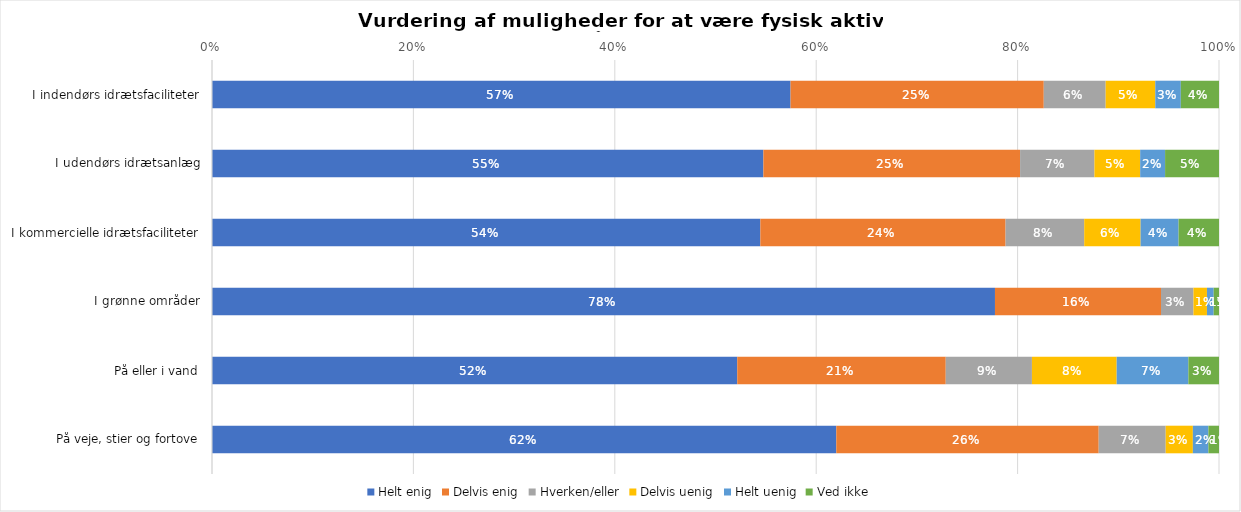
| Category | Helt enig | Delvis enig | Hverken/eller | Delvis uenig | Helt uenig | Ved ikke |
|---|---|---|---|---|---|---|
| I indendørs idrætsfaciliteter | 0.575 | 0.251 | 0.061 | 0.049 | 0.025 | 0.038 |
| I udendørs idrætsanlæg | 0.548 | 0.255 | 0.074 | 0.045 | 0.025 | 0.054 |
| I kommercielle idrætsfaciliteter | 0.545 | 0.244 | 0.078 | 0.056 | 0.038 | 0.04 |
| I grønne områder | 0.778 | 0.165 | 0.032 | 0.013 | 0.007 | 0.005 |
| På eller i vand | 0.522 | 0.207 | 0.086 | 0.084 | 0.071 | 0.03 |
| På veje, stier og fortove | 0.62 | 0.261 | 0.067 | 0.027 | 0.015 | 0.011 |